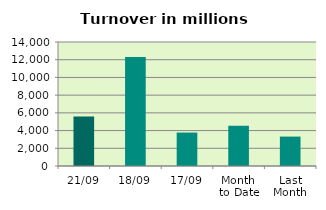
| Category | Series 0 |
|---|---|
| 21/09 | 5576.368 |
| 18/09 | 12301.832 |
| 17/09 | 3776.289 |
| Month 
to Date | 4542.669 |
| Last
Month | 3319.434 |